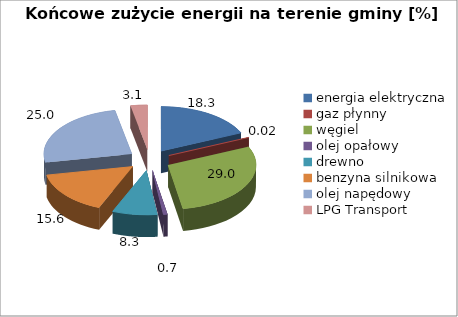
| Category | 18,3 0,02 29,0 0,7 8,3 15,6 25,0 3,1 |
|---|---|
| energia elektryczna | 18.258 |
| gaz płynny | 0.016 |
| węgiel | 29.012 |
| olej opałowy | 0.721 |
| drewno | 8.28 |
| benzyna silnikowa | 15.638 |
| olej napędowy | 24.991 |
| LPG Transport | 3.084 |